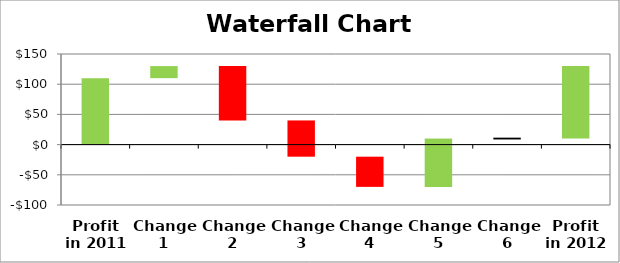
| Category | Series 0 | Series 1 | Series 2 | Series 3 | Series 4 | Series 5 | Series 6 | Series 7 |
|---|---|---|---|---|---|---|---|---|
| Profit in 2011 | 0 | 0 | 0 | 0 | 0 | 110 | 0 | 0 |
| Change 1 | 0 | 0 | 0 | 110 | 0 | 20 | 0 | 0 |
| Change 2 | 0 | 0 | 0 | 40 | 90 | 0 | 0 | 0 |
| Change 3 | 0 | -20 | 0 | 0 | 40 | 0 | 0 | 0 |
| Change 4 | -20 | -50 | 0 | 0 | 0 | 0 | 0 | 0 |
| Change 5 | 0 | 0 | -70 | 0 | 0 | 10 | 0 | 0 |
| Change 6 | 0 | 0 | 0 | 8.5 | 0 | 0 | 3 | 0 |
| Profit in 2012 | 0 | 0 | 0 | 10 | 0 | 120 | 0 | 0 |